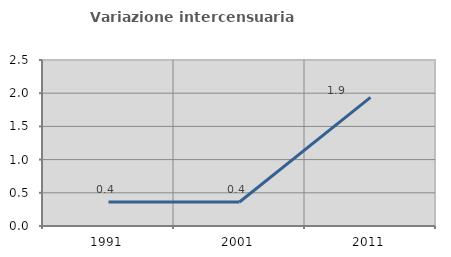
| Category | Variazione intercensuaria annua |
|---|---|
| 1991.0 | 0.362 |
| 2001.0 | 0.361 |
| 2011.0 | 1.938 |